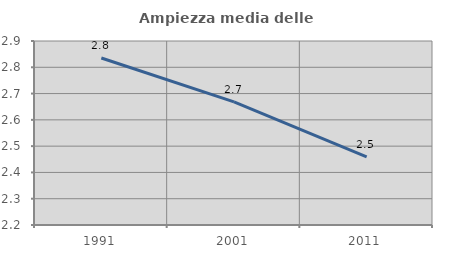
| Category | Ampiezza media delle famiglie |
|---|---|
| 1991.0 | 2.835 |
| 2001.0 | 2.668 |
| 2011.0 | 2.459 |